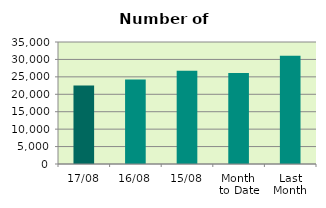
| Category | Series 0 |
|---|---|
| 17/08 | 22506 |
| 16/08 | 24210 |
| 15/08 | 26780 |
| Month 
to Date | 26085.692 |
| Last
Month | 31061.545 |